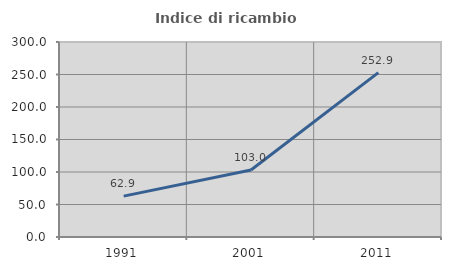
| Category | Indice di ricambio occupazionale  |
|---|---|
| 1991.0 | 62.903 |
| 2001.0 | 103.023 |
| 2011.0 | 252.903 |